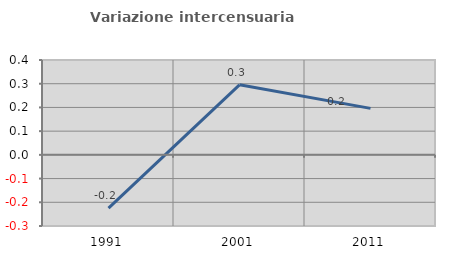
| Category | Variazione intercensuaria annua |
|---|---|
| 1991.0 | -0.225 |
| 2001.0 | 0.295 |
| 2011.0 | 0.196 |